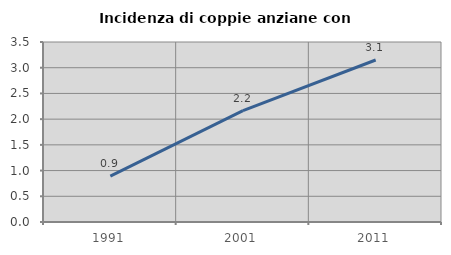
| Category | Incidenza di coppie anziane con figli |
|---|---|
| 1991.0 | 0.894 |
| 2001.0 | 2.167 |
| 2011.0 | 3.15 |